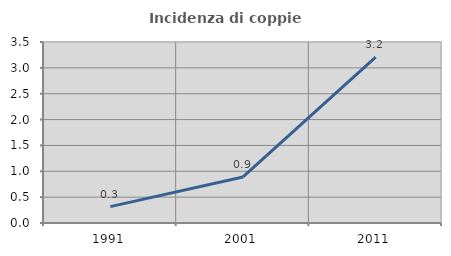
| Category | Incidenza di coppie miste |
|---|---|
| 1991.0 | 0.316 |
| 2001.0 | 0.89 |
| 2011.0 | 3.207 |